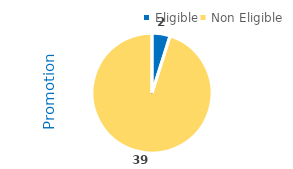
| Category | Total |
|---|---|
| Eligible | 2 |
| Non Eligible | 39 |